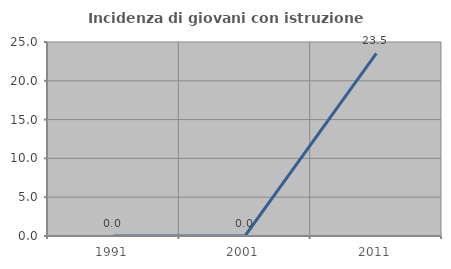
| Category | Incidenza di giovani con istruzione universitaria |
|---|---|
| 1991.0 | 0 |
| 2001.0 | 0 |
| 2011.0 | 23.529 |